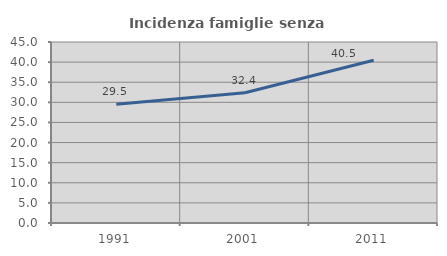
| Category | Incidenza famiglie senza nuclei |
|---|---|
| 1991.0 | 29.496 |
| 2001.0 | 32.38 |
| 2011.0 | 40.473 |